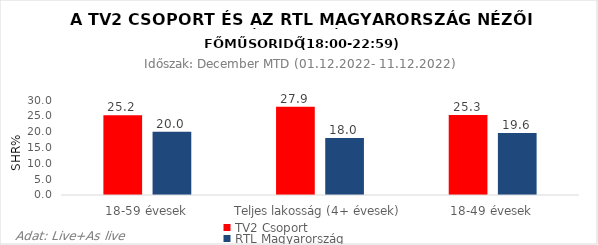
| Category | TV2 Csoport | RTL Magyarország |
|---|---|---|
| 18-59 évesek | 25.2 | 20 |
| Teljes lakosság (4+ évesek) | 27.9 | 18 |
| 18-49 évesek | 25.3 | 19.6 |